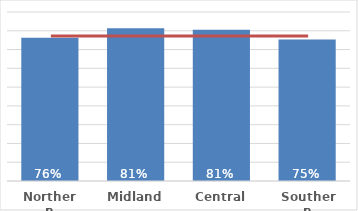
| Category | Pacific |
|---|---|
| Northern | 0.763 |
| Midland | 0.814 |
| Central | 0.805 |
| Southern | 0.754 |